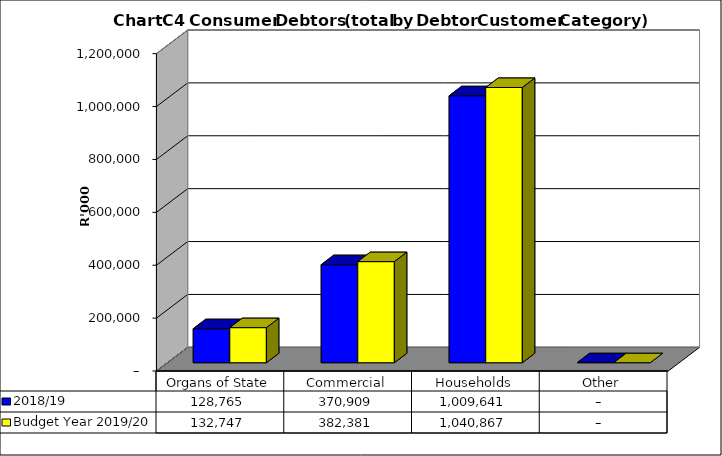
| Category |  2018/19  | Budget Year 2019/20 |
|---|---|---|
| Organs of State | 128765064.33 | 132747489 |
| Commercial | 370909426.44 | 382380852 |
| Households | 1009640829.95 | 1040866835 |
| Other | 0 | 0 |